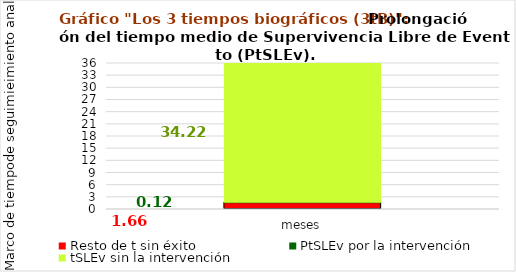
| Category | Resto de t sin éxito | PtSLEv por la intervención | tSLEv sin la intervención |
|---|---|---|---|
| meses | 1.664 | 0.116 | 34.22 |